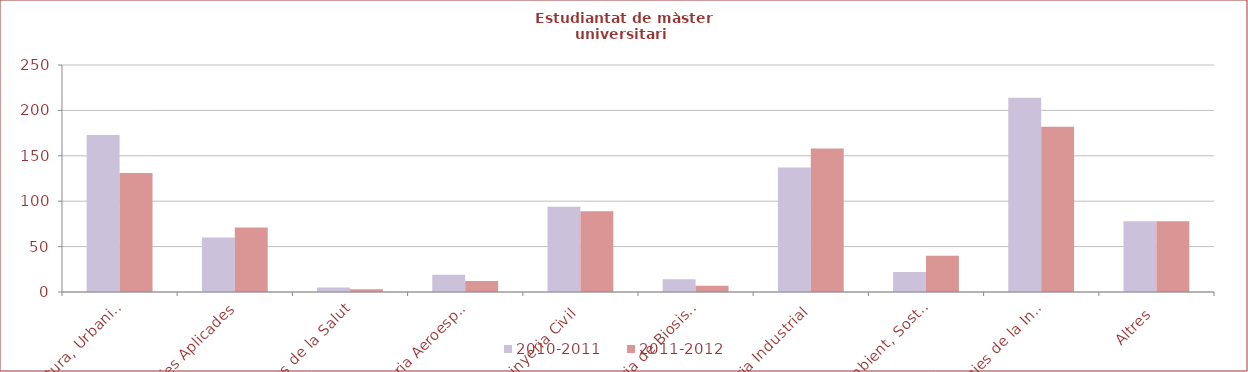
| Category | 2010-2011 | 2011-2012 |
|---|---|---|
| Arquitectura, Urbanisme i Edificació | 173 | 131 |
| Ciències Aplicades | 60 | 71 |
| Ciències de la Salut | 5 | 3 |
| Enginyeria Aeroespacial | 19 | 12 |
| Enginyeria Civil | 94 | 89 |
| Enginyeria de Biosistemes | 14 | 7 |
| Enginyeria Industrial | 137 | 158 |
| Medi Ambient, Sostenibilitat i Recursos Naturals | 22 | 40 |
| Tecnologies de la Informació i les Comunicacions | 214 | 182 |
| Altres | 78 | 78 |